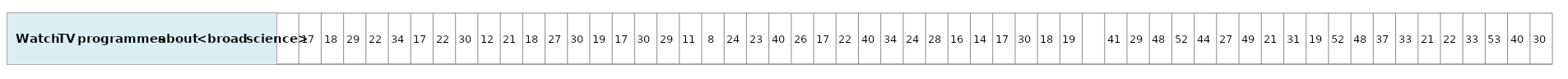
| Category | Watch TV programmes about <broad science> |
|---|---|
| nan | 1 |
| 16.5985195278565 | 1 |
| 17.95089724233181 | 1 |
| 29.21216459483151 | 1 |
| 22.14287927568902 | 1 |
| 33.62989206729664 | 1 |
| 17.41406008902949 | 1 |
| 21.77043981439481 | 1 |
| 30.34316441983335 | 1 |
| 12.1345309820691 | 1 |
| 20.80250826645625 | 1 |
| 17.91066647851983 | 1 |
| 27.20575912662952 | 1 |
| 30.45928959081301 | 1 |
| 18.91775937557098 | 1 |
| 16.8376010712671 | 1 |
| 30.3800389735267 | 1 |
| 28.85981104899406 | 1 |
| 10.86462380389009 | 1 |
| 7.569286591790632 | 1 |
| 23.71466588765597 | 1 |
| 23.49318334431058 | 1 |
| 39.64587916702144 | 1 |
| 25.9206812908478 | 1 |
| 17.46179787949807 | 1 |
| 21.94494824438035 | 1 |
| 40.34189149798889 | 1 |
| 34.38383521344127 | 1 |
| 24.28113177687688 | 1 |
| 27.9243316300232 | 1 |
| 16.36970876080968 | 1 |
| 14.20104243899606 | 1 |
| 16.82945104472564 | 1 |
| 30.31669522010104 | 1 |
| 17.72290720704111 | 1 |
| 18.63420312479219 | 1 |
| nan | 1 |
| 40.5048019002626 | 1 |
| 28.7075809338695 | 1 |
| 48.08520348682676 | 1 |
| 52.49367031934393 | 1 |
| 44.0958697161103 | 1 |
| 26.94851720183554 | 1 |
| 48.78208925942182 | 1 |
| 21.288611506874 | 1 |
| 30.52970594252064 | 1 |
| 19.19127485873438 | 1 |
| 52.21612113512819 | 1 |
| 47.68699312054061 | 1 |
| 36.7219424837001 | 1 |
| 33.22112300621135 | 1 |
| 20.78427750207508 | 1 |
| 22.2962865444053 | 1 |
| 33.20625482642646 | 1 |
| 52.88112467870585 | 1 |
| 39.87866880640026 | 1 |
| 29.59274630200192 | 1 |